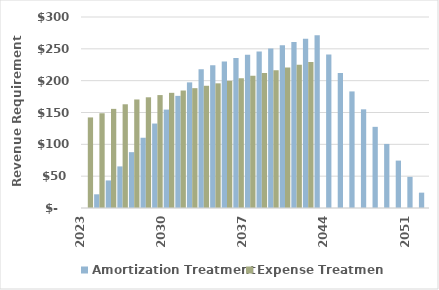
| Category | Amortization Treatment | Expense Treatment |
|---|---|---|
| 2023.0 | 0 | 142.26 |
| 2024.0 | 21.512 | 148.822 |
| 2025.0 | 43.288 | 155.701 |
| 2026.0 | 65.341 | 162.914 |
| 2027.0 | 87.688 | 170.475 |
| 2028.0 | 110.344 | 173.884 |
| 2029.0 | 132.643 | 177.362 |
| 2030.0 | 154.576 | 180.909 |
| 2031.0 | 176.138 | 184.527 |
| 2032.0 | 197.32 | 188.218 |
| 2033.0 | 218.115 | 191.982 |
| 2034.0 | 224.29 | 195.822 |
| 2035.0 | 230.134 | 199.738 |
| 2036.0 | 235.642 | 203.733 |
| 2037.0 | 240.807 | 207.808 |
| 2038.0 | 245.623 | 211.964 |
| 2039.0 | 250.536 | 216.203 |
| 2040.0 | 255.546 | 220.527 |
| 2041.0 | 260.657 | 224.938 |
| 2042.0 | 265.871 | 229.436 |
| 2043.0 | 271.188 | 0 |
| 2044.0 | 241.223 | 0 |
| 2045.0 | 211.858 | 0 |
| 2046.0 | 183.104 | 0 |
| 2047.0 | 154.974 | 0 |
| 2048.0 | 127.479 | 0 |
| 2049.0 | 100.633 | 0 |
| 2050.0 | 74.449 | 0 |
| 2051.0 | 48.94 | 0 |
| 2052.0 | 24.119 | 0 |